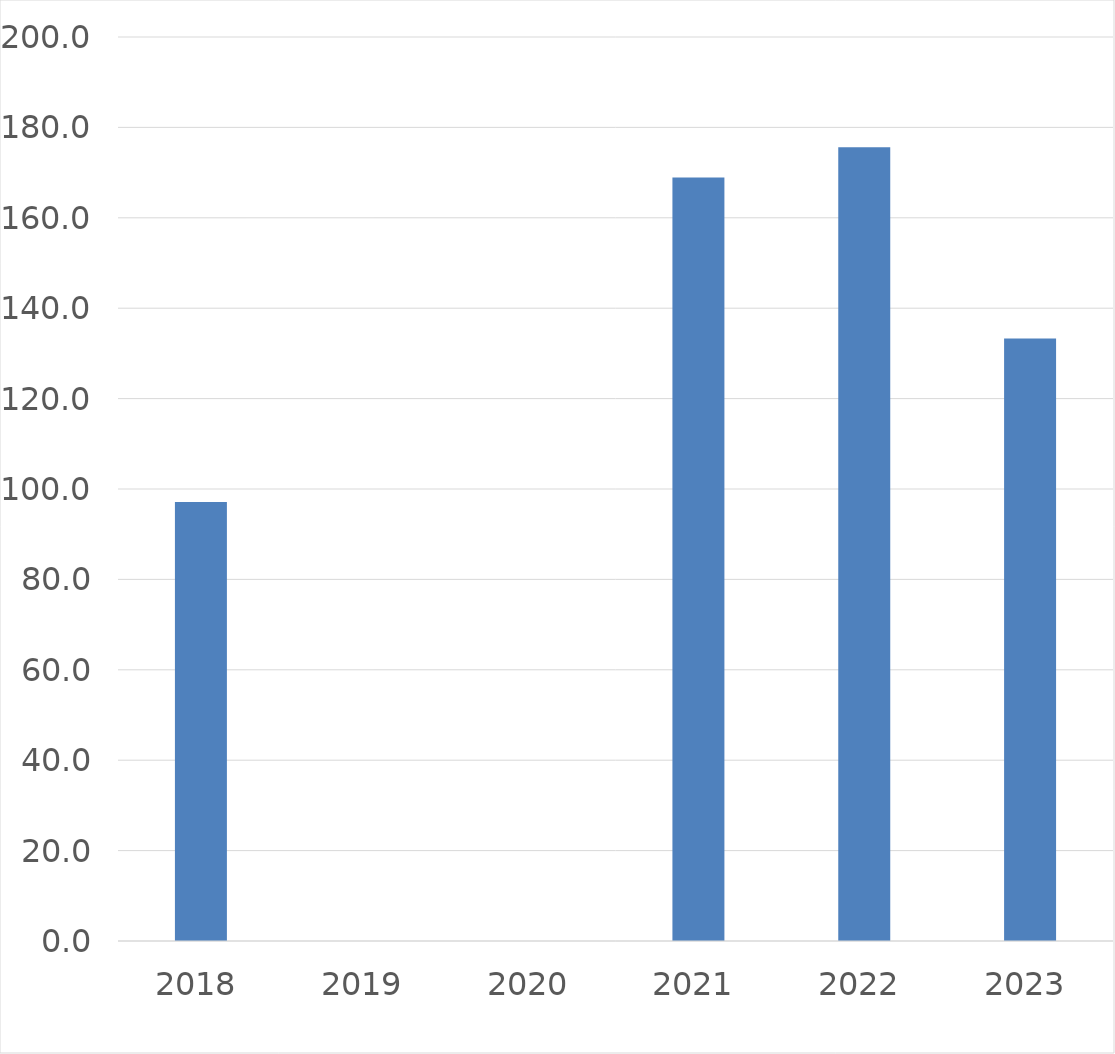
| Category | Series 0 |
|---|---|
| 2018 | 97.1 |
| 2019 | 0 |
| 2020 | 0 |
| 2021 | 168.9 |
| 2022 | 175.6 |
| 2023 | 133.3 |